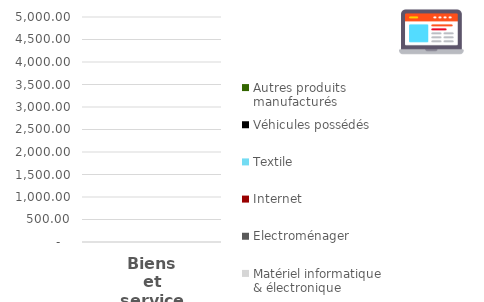
| Category | Matériel informatique & électronique  | Electroménager | Internet | Textile | Véhicules possédés | Autres produits manufacturés  |
|---|---|---|---|---|---|---|
| 0 | 0 | 0 | 0 | 0 | 0 | 0 |